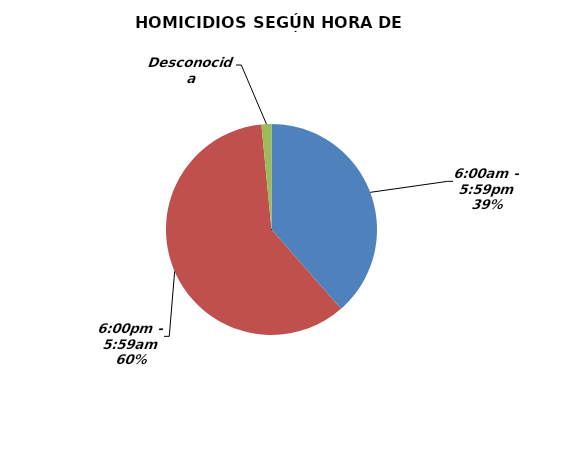
| Category | Series 0 |
|---|---|
| 6:00am - 5:59pm | 530 |
| 6:00pm - 5:59am | 824 |
| Desconocida | 21 |